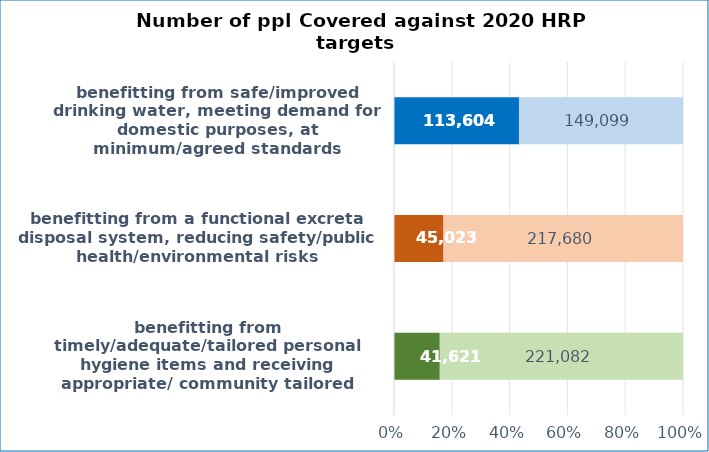
| Category | Coverage | Gap |
|---|---|---|
| benefitting from timely/adequate/tailored personal hygiene items and receiving appropriate/ community tailored messages that enable health seeking behavior | 41621 | 221082 |
| benefitting from a functional excreta disposal system, reducing safety/public health/environmental risks | 45023 | 217680 |
| benefitting from safe/improved drinking water, meeting demand for domestic purposes, at minimum/agreed standards | 113604 | 149099 |